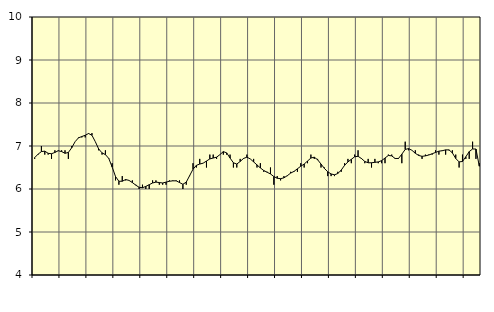
| Category | Piggar | Transport, SNI 49-53 |
|---|---|---|
| nan | 6.7 | 6.73 |
| 87.0 | 6.8 | 6.81 |
| 87.0 | 7 | 6.87 |
| 87.0 | 6.8 | 6.88 |
| nan | 6.8 | 6.83 |
| 88.0 | 6.7 | 6.82 |
| 88.0 | 6.9 | 6.85 |
| 88.0 | 6.9 | 6.89 |
| nan | 6.9 | 6.87 |
| 89.0 | 6.9 | 6.83 |
| 89.0 | 6.7 | 6.85 |
| 89.0 | 7 | 6.96 |
| nan | 7.1 | 7.1 |
| 90.0 | 7.2 | 7.19 |
| 90.0 | 7.2 | 7.22 |
| 90.0 | 7.2 | 7.25 |
| nan | 7.3 | 7.29 |
| 91.0 | 7.3 | 7.25 |
| 91.0 | 7.1 | 7.1 |
| 91.0 | 6.9 | 6.93 |
| nan | 6.8 | 6.84 |
| 92.0 | 6.9 | 6.8 |
| 92.0 | 6.7 | 6.71 |
| 92.0 | 6.6 | 6.51 |
| nan | 6.2 | 6.29 |
| 93.0 | 6.1 | 6.18 |
| 93.0 | 6.3 | 6.18 |
| 93.0 | 6.2 | 6.22 |
| nan | 6.2 | 6.2 |
| 94.0 | 6.2 | 6.15 |
| 94.0 | 6.1 | 6.09 |
| 94.0 | 6 | 6.04 |
| nan | 6.1 | 6.03 |
| 95.0 | 6 | 6.06 |
| 95.0 | 6 | 6.1 |
| 95.0 | 6.2 | 6.14 |
| nan | 6.2 | 6.16 |
| 96.0 | 6.1 | 6.15 |
| 96.0 | 6.1 | 6.14 |
| 96.0 | 6.1 | 6.16 |
| nan | 6.2 | 6.18 |
| 97.0 | 6.2 | 6.19 |
| 97.0 | 6.2 | 6.19 |
| 97.0 | 6.2 | 6.15 |
| nan | 6 | 6.11 |
| 98.0 | 6.1 | 6.16 |
| 98.0 | 6.3 | 6.31 |
| 98.0 | 6.6 | 6.46 |
| nan | 6.5 | 6.55 |
| 99.0 | 6.7 | 6.58 |
| 99.0 | 6.6 | 6.6 |
| 99.0 | 6.5 | 6.65 |
| nan | 6.8 | 6.7 |
| 0.0 | 6.8 | 6.72 |
| 0.0 | 6.7 | 6.74 |
| 0.0 | 6.8 | 6.8 |
| nan | 6.8 | 6.87 |
| 1.0 | 6.8 | 6.84 |
| 1.0 | 6.8 | 6.72 |
| 1.0 | 6.5 | 6.61 |
| nan | 6.5 | 6.58 |
| 2.0 | 6.7 | 6.64 |
| 2.0 | 6.7 | 6.71 |
| 2.0 | 6.8 | 6.74 |
| nan | 6.7 | 6.7 |
| 3.0 | 6.7 | 6.63 |
| 3.0 | 6.5 | 6.56 |
| 3.0 | 6.6 | 6.49 |
| nan | 6.4 | 6.43 |
| 4.0 | 6.4 | 6.39 |
| 4.0 | 6.5 | 6.35 |
| 4.0 | 6.1 | 6.29 |
| nan | 6.3 | 6.25 |
| 5.0 | 6.2 | 6.24 |
| 5.0 | 6.3 | 6.26 |
| 5.0 | 6.3 | 6.31 |
| nan | 6.4 | 6.37 |
| 6.0 | 6.4 | 6.41 |
| 6.0 | 6.4 | 6.47 |
| 6.0 | 6.6 | 6.53 |
| nan | 6.5 | 6.58 |
| 7.0 | 6.6 | 6.65 |
| 7.0 | 6.8 | 6.72 |
| 7.0 | 6.7 | 6.74 |
| nan | 6.7 | 6.68 |
| 8.0 | 6.5 | 6.58 |
| 8.0 | 6.5 | 6.48 |
| 8.0 | 6.3 | 6.4 |
| nan | 6.3 | 6.35 |
| 9.0 | 6.3 | 6.33 |
| 9.0 | 6.4 | 6.36 |
| 9.0 | 6.4 | 6.44 |
| nan | 6.6 | 6.55 |
| 10.0 | 6.7 | 6.63 |
| 10.0 | 6.6 | 6.69 |
| 10.0 | 6.8 | 6.75 |
| nan | 6.9 | 6.76 |
| 11.0 | 6.7 | 6.71 |
| 11.0 | 6.6 | 6.64 |
| 11.0 | 6.7 | 6.61 |
| nan | 6.5 | 6.61 |
| 12.0 | 6.7 | 6.62 |
| 12.0 | 6.6 | 6.63 |
| 12.0 | 6.6 | 6.66 |
| nan | 6.6 | 6.72 |
| 13.0 | 6.8 | 6.78 |
| 13.0 | 6.8 | 6.77 |
| 13.0 | 6.7 | 6.71 |
| nan | 6.7 | 6.71 |
| 14.0 | 6.6 | 6.81 |
| 14.0 | 7.1 | 6.92 |
| 14.0 | 6.9 | 6.94 |
| nan | 6.9 | 6.9 |
| 15.0 | 6.9 | 6.83 |
| 15.0 | 6.8 | 6.78 |
| 15.0 | 6.7 | 6.76 |
| nan | 6.8 | 6.77 |
| 16.0 | 6.8 | 6.79 |
| 16.0 | 6.8 | 6.82 |
| 16.0 | 6.9 | 6.85 |
| nan | 6.8 | 6.88 |
| 17.0 | 6.9 | 6.89 |
| 17.0 | 6.8 | 6.91 |
| 17.0 | 6.9 | 6.91 |
| nan | 6.9 | 6.84 |
| 18.0 | 6.8 | 6.71 |
| 18.0 | 6.5 | 6.63 |
| 18.0 | 6.8 | 6.64 |
| nan | 6.7 | 6.75 |
| 19.0 | 6.7 | 6.87 |
| 19.0 | 7.1 | 6.93 |
| 19.0 | 6.7 | 6.93 |
| nan | 6.6 | 6.53 |